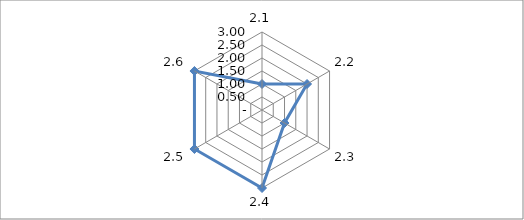
| Category | Series 0 |
|---|---|
| 2.1 | 1 |
| 2.2 | 2 |
| 2.3 | 1 |
| 2.4 | 3 |
| 2.5 | 3 |
| 2.6 | 3 |